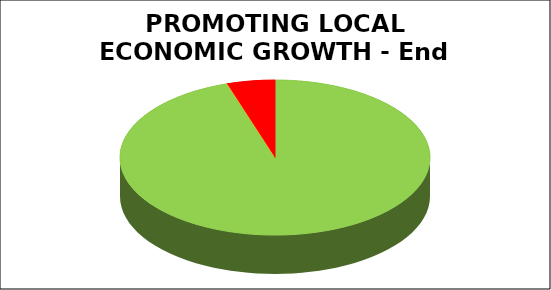
| Category | Series 0 |
|---|---|
| Green | 0.95 |
| Amber | 0 |
| Red | 0.05 |